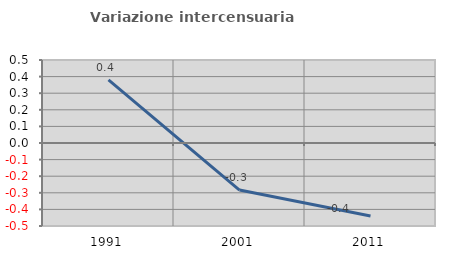
| Category | Variazione intercensuaria annua |
|---|---|
| 1991.0 | 0.38 |
| 2001.0 | -0.283 |
| 2011.0 | -0.44 |